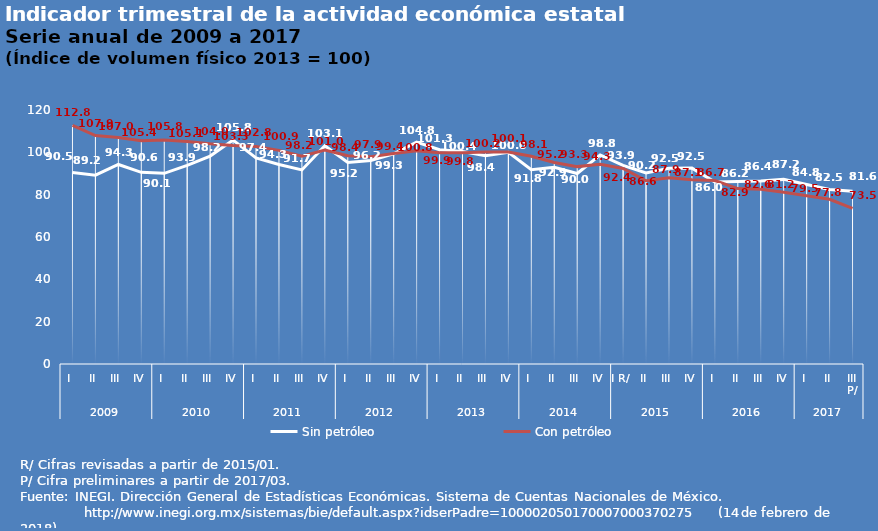
| Category | Sin petróleo | Con petróleo |
|---|---|---|
| 0 | 90.509 | 112.781 |
| 1 | 89.236 | 107.919 |
| 2 | 94.266 | 106.97 |
| 3 | 90.564 | 105.432 |
| 4 | 90.068 | 105.8 |
| 5 | 93.869 | 105.126 |
| 6 | 98.244 | 104.029 |
| 7 | 105.784 | 103.286 |
| 8 | 97.401 | 102.813 |
| 9 | 94.268 | 100.939 |
| 10 | 91.689 | 98.229 |
| 11 | 103.109 | 101.025 |
| 12 | 95.231 | 98.358 |
| 13 | 96.163 | 97.934 |
| 14 | 99.252 | 99.44 |
| 15 | 104.812 | 100.774 |
| 16 | 101.262 | 99.857 |
| 17 | 100.402 | 99.818 |
| 18 | 98.362 | 100.183 |
| 19 | 99.974 | 100.142 |
| 20 | 91.763 | 98.126 |
| 21 | 92.908 | 95.228 |
| 22 | 89.999 | 93.253 |
| 23 | 98.764 | 94.345 |
| 24 | 93.862 | 92.363 |
| 25 | 90.236 | 86.557 |
| 26 | 92.455 | 87.944 |
| 27 | 92.549 | 87.092 |
| 28 | 85.982 | 86.651 |
| 29 | 86.17 | 82.879 |
| 30 | 86.437 | 82.602 |
| 31 | 87.22 | 81.163 |
| 32 | 84.796 | 79.514 |
| 33 | 82.45 | 77.816 |
| 34 | 81.56 | 73.487 |